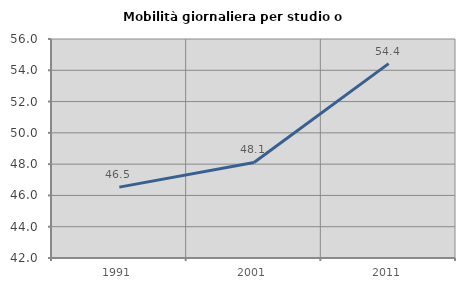
| Category | Mobilità giornaliera per studio o lavoro |
|---|---|
| 1991.0 | 46.531 |
| 2001.0 | 48.11 |
| 2011.0 | 54.425 |